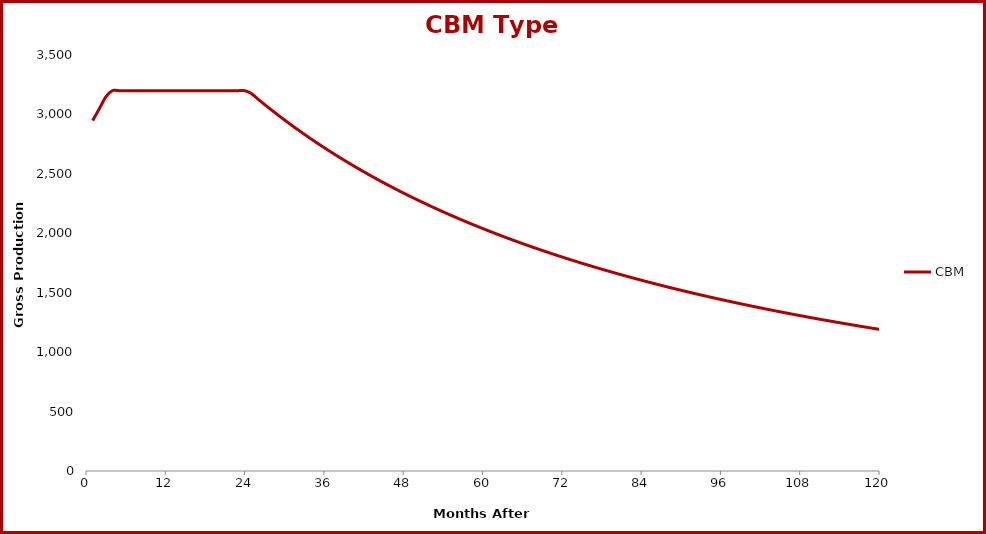
| Category | CBM |
|---|---|
| 1.0 | 2948.104 |
| 2.0 | 3046.446 |
| 3.0 | 3148.068 |
| 4.0 | 3200 |
| 5.0 | 3200 |
| 6.0 | 3200 |
| 7.0 | 3200 |
| 8.0 | 3200 |
| 9.0 | 3200 |
| 10.0 | 3200 |
| 11.0 | 3200 |
| 12.0 | 3200 |
| 13.0 | 3200 |
| 14.0 | 3200 |
| 15.0 | 3200 |
| 16.0 | 3200 |
| 17.0 | 3200 |
| 18.0 | 3200 |
| 19.0 | 3200 |
| 20.0 | 3200 |
| 21.0 | 3200 |
| 22.0 | 3200 |
| 23.0 | 3200 |
| 24.0 | 3200 |
| 25.0 | 3176.366 |
| 26.0 | 3129.882 |
| 27.0 | 3084.543 |
| 28.0 | 3040.309 |
| 29.0 | 2997.143 |
| 30.0 | 2955.009 |
| 31.0 | 2913.871 |
| 32.0 | 2873.698 |
| 33.0 | 2834.458 |
| 34.0 | 2796.119 |
| 35.0 | 2758.654 |
| 36.0 | 2722.035 |
| 37.0 | 2686.234 |
| 38.0 | 2651.226 |
| 39.0 | 2616.987 |
| 40.0 | 2583.493 |
| 41.0 | 2550.721 |
| 42.0 | 2518.65 |
| 43.0 | 2487.258 |
| 44.0 | 2456.526 |
| 45.0 | 2426.433 |
| 46.0 | 2396.962 |
| 47.0 | 2368.095 |
| 48.0 | 2339.813 |
| 49.0 | 2312.101 |
| 50.0 | 2284.942 |
| 51.0 | 2258.322 |
| 52.0 | 2232.224 |
| 53.0 | 2206.634 |
| 54.0 | 2181.54 |
| 55.0 | 2156.927 |
| 56.0 | 2132.782 |
| 57.0 | 2109.093 |
| 58.0 | 2085.848 |
| 59.0 | 2063.035 |
| 60.0 | 2040.643 |
| 61.0 | 2018.661 |
| 62.0 | 1997.079 |
| 63.0 | 1975.886 |
| 64.0 | 1955.072 |
| 65.0 | 1934.629 |
| 66.0 | 1914.546 |
| 67.0 | 1894.815 |
| 68.0 | 1875.427 |
| 69.0 | 1856.375 |
| 70.0 | 1837.649 |
| 71.0 | 1819.241 |
| 72.0 | 1801.145 |
| 73.0 | 1783.353 |
| 74.0 | 1765.858 |
| 75.0 | 1748.652 |
| 76.0 | 1731.73 |
| 77.0 | 1715.084 |
| 78.0 | 1698.708 |
| 79.0 | 1682.596 |
| 80.0 | 1666.743 |
| 81.0 | 1651.141 |
| 82.0 | 1635.787 |
| 83.0 | 1620.673 |
| 84.0 | 1605.795 |
| 85.0 | 1591.148 |
| 86.0 | 1576.727 |
| 87.0 | 1562.526 |
| 88.0 | 1548.542 |
| 89.0 | 1534.769 |
| 90.0 | 1521.203 |
| 91.0 | 1507.839 |
| 92.0 | 1494.674 |
| 93.0 | 1481.703 |
| 94.0 | 1468.923 |
| 95.0 | 1456.328 |
| 96.0 | 1443.916 |
| 97.0 | 1431.683 |
| 98.0 | 1419.625 |
| 99.0 | 1407.739 |
| 100.0 | 1396.021 |
| 101.0 | 1384.467 |
| 102.0 | 1373.076 |
| 103.0 | 1361.842 |
| 104.0 | 1350.765 |
| 105.0 | 1339.839 |
| 106.0 | 1329.063 |
| 107.0 | 1318.433 |
| 108.0 | 1307.947 |
| 109.0 | 1297.602 |
| 110.0 | 1287.395 |
| 111.0 | 1277.325 |
| 112.0 | 1267.387 |
| 113.0 | 1257.58 |
| 114.0 | 1247.901 |
| 115.0 | 1238.348 |
| 116.0 | 1228.919 |
| 117.0 | 1219.612 |
| 118.0 | 1210.423 |
| 119.0 | 1201.352 |
| 120.0 | 1192.395 |
| 121.0 | 1183.552 |
| 122.0 | 1174.819 |
| 123.0 | 1166.196 |
| 124.0 | 1157.679 |
| 125.0 | 1149.268 |
| 126.0 | 1140.96 |
| 127.0 | 1132.754 |
| 128.0 | 1124.647 |
| 129.0 | 1116.639 |
| 130.0 | 1108.727 |
| 131.0 | 1100.91 |
| 132.0 | 1093.186 |
| 133.0 | 1085.553 |
| 134.0 | 1078.011 |
| 135.0 | 1070.558 |
| 136.0 | 1063.192 |
| 137.0 | 1055.911 |
| 138.0 | 1048.715 |
| 139.0 | 1041.602 |
| 140.0 | 1034.57 |
| 141.0 | 1027.619 |
| 142.0 | 1020.747 |
| 143.0 | 1013.953 |
| 144.0 | 1007.235 |
| 145.0 | 1000.592 |
| 146.0 | 994.024 |
| 147.0 | 987.528 |
| 148.0 | 981.105 |
| 149.0 | 974.752 |
| 150.0 | 968.468 |
| 151.0 | 962.254 |
| 152.0 | 956.106 |
| 153.0 | 950.025 |
| 154.0 | 944.01 |
| 155.0 | 938.059 |
| 156.0 | 932.172 |
| 157.0 | 926.347 |
| 158.0 | 920.584 |
| 159.0 | 914.881 |
| 160.0 | 909.238 |
| 161.0 | 903.654 |
| 162.0 | 898.129 |
| 163.0 | 892.66 |
| 164.0 | 887.248 |
| 165.0 | 881.891 |
| 166.0 | 876.589 |
| 167.0 | 871.341 |
| 168.0 | 866.146 |
| 169.0 | 861.004 |
| 170.0 | 855.913 |
| 171.0 | 850.873 |
| 172.0 | 845.884 |
| 173.0 | 840.944 |
| 174.0 | 836.053 |
| 175.0 | 831.21 |
| 176.0 | 826.415 |
| 177.0 | 821.666 |
| 178.0 | 816.964 |
| 179.0 | 812.307 |
| 180.0 | 807.695 |
| 181.0 | 803.127 |
| 182.0 | 798.603 |
| 183.0 | 794.123 |
| 184.0 | 789.685 |
| 185.0 | 785.289 |
| 186.0 | 780.934 |
| 187.0 | 776.62 |
| 188.0 | 772.347 |
| 189.0 | 768.113 |
| 190.0 | 763.919 |
| 191.0 | 759.763 |
| 192.0 | 755.646 |
| 193.0 | 751.567 |
| 194.0 | 747.525 |
| 195.0 | 743.519 |
| 196.0 | 739.55 |
| 197.0 | 735.617 |
| 198.0 | 731.72 |
| 199.0 | 727.857 |
| 200.0 | 724.029 |
| 201.0 | 720.235 |
| 202.0 | 716.474 |
| 203.0 | 712.747 |
| 204.0 | 709.053 |
| 205.0 | 705.391 |
| 206.0 | 701.761 |
| 207.0 | 698.163 |
| 208.0 | 694.596 |
| 209.0 | 691.06 |
| 210.0 | 687.555 |
| 211.0 | 684.079 |
| 212.0 | 680.634 |
| 213.0 | 677.217 |
| 214.0 | 673.83 |
| 215.0 | 670.472 |
| 216.0 | 667.141 |
| 217.0 | 663.839 |
| 218.0 | 660.565 |
| 219.0 | 657.318 |
| 220.0 | 654.098 |
| 221.0 | 650.904 |
| 222.0 | 647.738 |
| 223.0 | 644.597 |
| 224.0 | 641.482 |
| 225.0 | 638.392 |
| 226.0 | 635.328 |
| 227.0 | 632.289 |
| 228.0 | 629.274 |
| 229.0 | 626.283 |
| 230.0 | 623.317 |
| 231.0 | 620.375 |
| 232.0 | 617.456 |
| 233.0 | 614.56 |
| 234.0 | 611.687 |
| 235.0 | 608.837 |
| 236.0 | 606.01 |
| 237.0 | 603.205 |
| 238.0 | 600.422 |
| 239.0 | 597.66 |
| 240.0 | 594.92 |
| 241.0 | 592.202 |
| 242.0 | 589.504 |
| 243.0 | 586.828 |
| 244.0 | 584.171 |
| 245.0 | 581.536 |
| 246.0 | 578.92 |
| 247.0 | 576.324 |
| 248.0 | 573.748 |
| 249.0 | 571.192 |
| 250.0 | 568.655 |
| 251.0 | 566.137 |
| 252.0 | 563.638 |
| 253.0 | 561.157 |
| 254.0 | 558.695 |
| 255.0 | 556.252 |
| 256.0 | 553.826 |
| 257.0 | 551.419 |
| 258.0 | 549.029 |
| 259.0 | 546.656 |
| 260.0 | 544.302 |
| 261.0 | 541.964 |
| 262.0 | 539.643 |
| 263.0 | 537.339 |
| 264.0 | 535.052 |
| 265.0 | 532.781 |
| 266.0 | 530.527 |
| 267.0 | 528.289 |
| 268.0 | 526.067 |
| 269.0 | 523.86 |
| 270.0 | 521.67 |
| 271.0 | 519.494 |
| 272.0 | 517.335 |
| 273.0 | 515.19 |
| 274.0 | 513.061 |
| 275.0 | 510.946 |
| 276.0 | 508.846 |
| 277.0 | 506.761 |
| 278.0 | 504.69 |
| 279.0 | 502.634 |
| 280.0 | 500.592 |
| 281.0 | 498.564 |
| 282.0 | 496.55 |
| 283.0 | 494.55 |
| 284.0 | 492.563 |
| 285.0 | 490.59 |
| 286.0 | 488.63 |
| 287.0 | 486.683 |
| 288.0 | 484.75 |
| 289.0 | 482.83 |
| 290.0 | 480.922 |
| 291.0 | 479.028 |
| 292.0 | 477.146 |
| 293.0 | 475.276 |
| 294.0 | 473.419 |
| 295.0 | 471.575 |
| 296.0 | 469.742 |
| 297.0 | 467.922 |
| 298.0 | 466.113 |
| 299.0 | 464.316 |
| 300.0 | 462.531 |
| 301.0 | 460.758 |
| 302.0 | 458.996 |
| 303.0 | 457.246 |
| 304.0 | 455.507 |
| 305.0 | 453.779 |
| 306.0 | 452.063 |
| 307.0 | 450.357 |
| 308.0 | 448.662 |
| 309.0 | 446.978 |
| 310.0 | 445.305 |
| 311.0 | 443.642 |
| 312.0 | 441.99 |
| 313.0 | 440.349 |
| 314.0 | 438.717 |
| 315.0 | 437.096 |
| 316.0 | 435.485 |
| 317.0 | 433.884 |
| 318.0 | 432.294 |
| 319.0 | 430.713 |
| 320.0 | 429.141 |
| 321.0 | 427.58 |
| 322.0 | 426.028 |
| 323.0 | 424.486 |
| 324.0 | 422.953 |
| 325.0 | 421.43 |
| 326.0 | 419.915 |
| 327.0 | 418.411 |
| 328.0 | 416.915 |
| 329.0 | 415.428 |
| 330.0 | 413.95 |
| 331.0 | 412.482 |
| 332.0 | 411.022 |
| 333.0 | 409.571 |
| 334.0 | 408.128 |
| 335.0 | 406.694 |
| 336.0 | 405.269 |
| 337.0 | 403.852 |
| 338.0 | 402.444 |
| 339.0 | 401.043 |
| 340.0 | 399.652 |
| 341.0 | 398.268 |
| 342.0 | 396.892 |
| 343.0 | 395.525 |
| 344.0 | 394.165 |
| 345.0 | 392.814 |
| 346.0 | 391.47 |
| 347.0 | 390.134 |
| 348.0 | 388.806 |
| 349.0 | 387.485 |
| 350.0 | 386.169 |
| 351.0 | 384.858 |
| 352.0 | 383.551 |
| 353.0 | 382.248 |
| 354.0 | 380.95 |
| 355.0 | 379.656 |
| 356.0 | 378.367 |
| 357.0 | 377.082 |
| 358.0 | 375.801 |
| 359.0 | 374.525 |
| 360.0 | 373.253 |
| 361.0 | 371.986 |
| 362.0 | 370.722 |
| 363.0 | 369.463 |
| 364.0 | 368.209 |
| 365.0 | 366.958 |
| 366.0 | 365.712 |
| 367.0 | 364.47 |
| 368.0 | 363.232 |
| 369.0 | 361.999 |
| 370.0 | 360.769 |
| 371.0 | 359.544 |
| 372.0 | 358.323 |
| 373.0 | 357.106 |
| 374.0 | 355.893 |
| 375.0 | 354.685 |
| 376.0 | 353.48 |
| 377.0 | 352.28 |
| 378.0 | 351.083 |
| 379.0 | 349.891 |
| 380.0 | 348.703 |
| 381.0 | 347.519 |
| 382.0 | 346.338 |
| 383.0 | 345.162 |
| 384.0 | 343.99 |
| 385.0 | 342.822 |
| 386.0 | 341.658 |
| 387.0 | 340.497 |
| 388.0 | 339.341 |
| 389.0 | 338.189 |
| 390.0 | 337.04 |
| 391.0 | 335.895 |
| 392.0 | 334.755 |
| 393.0 | 333.618 |
| 394.0 | 332.485 |
| 395.0 | 331.356 |
| 396.0 | 330.23 |
| 397.0 | 329.109 |
| 398.0 | 327.991 |
| 399.0 | 326.877 |
| 400.0 | 325.767 |
| 401.0 | 324.661 |
| 402.0 | 323.558 |
| 403.0 | 322.46 |
| 404.0 | 321.365 |
| 405.0 | 320.273 |
| 406.0 | 319.185 |
| 407.0 | 318.102 |
| 408.0 | 317.021 |
| 409.0 | 315.945 |
| 410.0 | 314.872 |
| 411.0 | 313.802 |
| 412.0 | 312.737 |
| 413.0 | 311.675 |
| 414.0 | 310.616 |
| 415.0 | 309.561 |
| 416.0 | 308.51 |
| 417.0 | 307.462 |
| 418.0 | 306.418 |
| 419.0 | 305.377 |
| 420.0 | 304.34 |
| 421.0 | 303.307 |
| 422.0 | 302.277 |
| 423.0 | 301.25 |
| 424.0 | 300.227 |
| 425.0 | 299.208 |
| 426.0 | 298.191 |
| 427.0 | 297.179 |
| 428.0 | 296.17 |
| 429.0 | 295.164 |
| 430.0 | 294.161 |
| 431.0 | 293.162 |
| 432.0 | 292.167 |
| 433.0 | 291.175 |
| 434.0 | 290.186 |
| 435.0 | 289.2 |
| 436.0 | 288.218 |
| 437.0 | 287.239 |
| 438.0 | 286.264 |
| 439.0 | 285.292 |
| 440.0 | 284.323 |
| 441.0 | 283.357 |
| 442.0 | 282.395 |
| 443.0 | 281.436 |
| 444.0 | 280.48 |
| 445.0 | 279.528 |
| 446.0 | 278.578 |
| 447.0 | 277.632 |
| 448.0 | 276.689 |
| 449.0 | 275.75 |
| 450.0 | 274.813 |
| 451.0 | 273.88 |
| 452.0 | 272.95 |
| 453.0 | 272.023 |
| 454.0 | 271.099 |
| 455.0 | 270.178 |
| 456.0 | 269.261 |
| 457.0 | 268.346 |
| 458.0 | 267.435 |
| 459.0 | 266.527 |
| 460.0 | 265.622 |
| 461.0 | 264.72 |
| 462.0 | 263.821 |
| 463.0 | 262.925 |
| 464.0 | 262.032 |
| 465.0 | 261.142 |
| 466.0 | 260.255 |
| 467.0 | 259.371 |
| 468.0 | 258.49 |
| 469.0 | 257.613 |
| 470.0 | 256.738 |
| 471.0 | 255.866 |
| 472.0 | 254.997 |
| 473.0 | 254.131 |
| 474.0 | 253.268 |
| 475.0 | 252.408 |
| 476.0 | 251.551 |
| 477.0 | 250.696 |
| 478.0 | 249.845 |
| 479.0 | 248.996 |
| 480.0 | 248.151 |
| 481.0 | 247.308 |
| 482.0 | 246.468 |
| 483.0 | 245.631 |
| 484.0 | 244.797 |
| 485.0 | 243.966 |
| 486.0 | 243.137 |
| 487.0 | 242.311 |
| 488.0 | 241.489 |
| 489.0 | 240.668 |
| 490.0 | 239.851 |
| 491.0 | 239.037 |
| 492.0 | 238.225 |
| 493.0 | 237.416 |
| 494.0 | 236.61 |
| 495.0 | 235.806 |
| 496.0 | 235.005 |
| 497.0 | 234.207 |
| 498.0 | 233.412 |
| 499.0 | 232.619 |
| 500.0 | 231.829 |
| 501.0 | 231.042 |
| 502.0 | 230.257 |
| 503.0 | 229.475 |
| 504.0 | 228.696 |
| 505.0 | 227.919 |
| 506.0 | 227.145 |
| 507.0 | 226.374 |
| 508.0 | 225.605 |
| 509.0 | 224.839 |
| 510.0 | 224.075 |
| 511.0 | 223.314 |
| 512.0 | 222.556 |
| 513.0 | 221.8 |
| 514.0 | 221.047 |
| 515.0 | 220.296 |
| 516.0 | 219.548 |
| 517.0 | 218.802 |
| 518.0 | 218.059 |
| 519.0 | 217.319 |
| 520.0 | 216.581 |
| 521.0 | 215.845 |
| 522.0 | 215.112 |
| 523.0 | 214.382 |
| 524.0 | 213.654 |
| 525.0 | 212.928 |
| 526.0 | 212.205 |
| 527.0 | 211.484 |
| 528.0 | 210.766 |
| 529.0 | 210.05 |
| 530.0 | 209.337 |
| 531.0 | 208.626 |
| 532.0 | 207.918 |
| 533.0 | 207.211 |
| 534.0 | 206.508 |
| 535.0 | 205.806 |
| 536.0 | 205.107 |
| 537.0 | 204.411 |
| 538.0 | 203.717 |
| 539.0 | 203.025 |
| 540.0 | 202.335 |
| 541.0 | 201.648 |
| 542.0 | 200.963 |
| 543.0 | 200.281 |
| 544.0 | 199.601 |
| 545.0 | 198.923 |
| 546.0 | 198.247 |
| 547.0 | 197.574 |
| 548.0 | 196.903 |
| 549.0 | 196.234 |
| 550.0 | 195.568 |
| 551.0 | 194.904 |
| 552.0 | 194.242 |
| 553.0 | 193.582 |
| 554.0 | 192.925 |
| 555.0 | 192.27 |
| 556.0 | 191.617 |
| 557.0 | 190.966 |
| 558.0 | 190.318 |
| 559.0 | 189.671 |
| 560.0 | 189.027 |
| 561.0 | 188.385 |
| 562.0 | 187.745 |
| 563.0 | 187.108 |
| 564.0 | 186.472 |
| 565.0 | 185.839 |
| 566.0 | 185.208 |
| 567.0 | 184.579 |
| 568.0 | 183.952 |
| 569.0 | 183.327 |
| 570.0 | 182.705 |
| 571.0 | 182.084 |
| 572.0 | 181.466 |
| 573.0 | 180.85 |
| 574.0 | 180.236 |
| 575.0 | 179.623 |
| 576.0 | 179.013 |
| 577.0 | 178.405 |
| 578.0 | 177.8 |
| 579.0 | 177.196 |
| 580.0 | 176.594 |
| 581.0 | 175.994 |
| 582.0 | 175.397 |
| 583.0 | 174.801 |
| 584.0 | 174.207 |
| 585.0 | 173.616 |
| 586.0 | 173.026 |
| 587.0 | 172.439 |
| 588.0 | 171.853 |
| 589.0 | 171.269 |
| 590.0 | 170.688 |
| 591.0 | 170.108 |
| 592.0 | 169.53 |
| 593.0 | 168.955 |
| 594.0 | 168.381 |
| 595.0 | 167.809 |
| 596.0 | 167.239 |
| 597.0 | 166.671 |
| 598.0 | 166.105 |
| 599.0 | 165.541 |
| 600.0 | 164.979 |
| 601.0 | 164.419 |
| 602.0 | 163.86 |
| 603.0 | 163.304 |
| 604.0 | 162.749 |
| 605.0 | 162.196 |
| 606.0 | 161.646 |
| 607.0 | 161.097 |
| 608.0 | 160.549 |
| 609.0 | 160.004 |
| 610.0 | 159.461 |
| 611.0 | 158.919 |
| 612.0 | 158.38 |
| 613.0 | 157.842 |
| 614.0 | 157.306 |
| 615.0 | 156.772 |
| 616.0 | 156.239 |
| 617.0 | 155.709 |
| 618.0 | 155.18 |
| 619.0 | 154.653 |
| 620.0 | 154.128 |
| 621.0 | 153.604 |
| 622.0 | 153.082 |
| 623.0 | 152.563 |
| 624.0 | 152.044 |
| 625.0 | 151.528 |
| 626.0 | 151.013 |
| 627.0 | 150.501 |
| 628.0 | 149.99 |
| 629.0 | 149.48 |
| 630.0 | 148.973 |
| 631.0 | 148.467 |
| 632.0 | 147.962 |
| 633.0 | 147.46 |
| 634.0 | 146.959 |
| 635.0 | 146.46 |
| 636.0 | 145.963 |
| 637.0 | 145.467 |
| 638.0 | 144.973 |
| 639.0 | 144.481 |
| 640.0 | 143.99 |
| 641.0 | 143.501 |
| 642.0 | 143.014 |
| 643.0 | 142.528 |
| 644.0 | 142.044 |
| 645.0 | 141.562 |
| 646.0 | 141.081 |
| 647.0 | 140.602 |
| 648.0 | 140.124 |
| 649.0 | 139.648 |
| 650.0 | 139.174 |
| 651.0 | 138.701 |
| 652.0 | 138.23 |
| 653.0 | 137.761 |
| 654.0 | 137.293 |
| 655.0 | 136.827 |
| 656.0 | 136.362 |
| 657.0 | 135.899 |
| 658.0 | 135.438 |
| 659.0 | 134.978 |
| 660.0 | 134.519 |
| 661.0 | 134.062 |
| 662.0 | 133.607 |
| 663.0 | 133.153 |
| 664.0 | 132.701 |
| 665.0 | 132.25 |
| 666.0 | 131.801 |
| 667.0 | 131.354 |
| 668.0 | 130.908 |
| 669.0 | 130.463 |
| 670.0 | 130.02 |
| 671.0 | 129.578 |
| 672.0 | 129.138 |
| 673.0 | 128.7 |
| 674.0 | 128.263 |
| 675.0 | 127.827 |
| 676.0 | 127.393 |
| 677.0 | 126.96 |
| 678.0 | 126.529 |
| 679.0 | 126.1 |
| 680.0 | 125.671 |
| 681.0 | 125.245 |
| 682.0 | 124.819 |
| 683.0 | 124.395 |
| 684.0 | 123.973 |
| 685.0 | 123.552 |
| 686.0 | 123.132 |
| 687.0 | 122.714 |
| 688.0 | 122.297 |
| 689.0 | 121.882 |
| 690.0 | 121.468 |
| 691.0 | 121.056 |
| 692.0 | 120.645 |
| 693.0 | 120.235 |
| 694.0 | 119.826 |
| 695.0 | 119.42 |
| 696.0 | 119.014 |
| 697.0 | 118.61 |
| 698.0 | 118.207 |
| 699.0 | 117.806 |
| 700.0 | 117.405 |
| 701.0 | 117.007 |
| 702.0 | 116.609 |
| 703.0 | 116.213 |
| 704.0 | 115.819 |
| 705.0 | 115.425 |
| 706.0 | 115.033 |
| 707.0 | 114.643 |
| 708.0 | 114.253 |
| 709.0 | 113.865 |
| 710.0 | 113.479 |
| 711.0 | 113.093 |
| 712.0 | 112.709 |
| 713.0 | 112.326 |
| 714.0 | 111.945 |
| 715.0 | 111.565 |
| 716.0 | 111.186 |
| 717.0 | 110.808 |
| 718.0 | 110.432 |
| 719.0 | 110.057 |
| 720.0 | 109.683 |
| 721.0 | 109.311 |
| 722.0 | 108.94 |
| 723.0 | 108.57 |
| 724.0 | 108.201 |
| 725.0 | 107.833 |
| 726.0 | 107.467 |
| 727.0 | 107.102 |
| 728.0 | 106.739 |
| 729.0 | 106.376 |
| 730.0 | 106.015 |
| 731.0 | 105.655 |
| 732.0 | 105.296 |
| 733.0 | 104.938 |
| 734.0 | 104.582 |
| 735.0 | 104.227 |
| 736.0 | 103.873 |
| 737.0 | 103.52 |
| 738.0 | 103.169 |
| 739.0 | 102.818 |
| 740.0 | 102.469 |
| 741.0 | 102.121 |
| 742.0 | 101.774 |
| 743.0 | 101.429 |
| 744.0 | 101.084 |
| 745.0 | 100.741 |
| 746.0 | 100.399 |
| 747.0 | 100.058 |
| 748.0 | 99.718 |
| 749.0 | 99.379 |
| 750.0 | 99.042 |
| 751.0 | 98.705 |
| 752.0 | 98.37 |
| 753.0 | 98.036 |
| 754.0 | 97.703 |
| 755.0 | 97.371 |
| 756.0 | 97.041 |
| 757.0 | 96.711 |
| 758.0 | 96.383 |
| 759.0 | 96.055 |
| 760.0 | 95.729 |
| 761.0 | 95.404 |
| 762.0 | 95.08 |
| 763.0 | 94.757 |
| 764.0 | 94.435 |
| 765.0 | 94.115 |
| 766.0 | 93.795 |
| 767.0 | 93.477 |
| 768.0 | 93.159 |
| 769.0 | 92.843 |
| 770.0 | 92.527 |
| 771.0 | 92.213 |
| 772.0 | 91.9 |
| 773.0 | 91.588 |
| 774.0 | 91.277 |
| 775.0 | 90.967 |
| 776.0 | 90.658 |
| 777.0 | 90.35 |
| 778.0 | 90.043 |
| 779.0 | 89.738 |
| 780.0 | 89.433 |